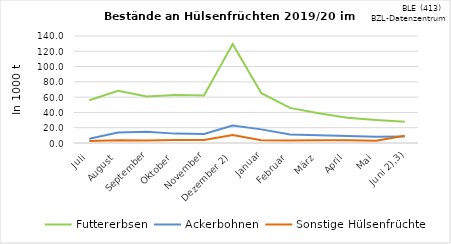
| Category | Futtererbsen | Ackerbohnen | Sonstige Hülsenfrüchte |
|---|---|---|---|
| Juli | 55.883 | 5.609 | 2.654 |
| August | 68.289 | 13.662 | 3.691 |
| September | 60.772 | 14.666 | 3.425 |
| Oktober | 62.687 | 12.267 | 3.814 |
| November | 62.228 | 11.939 | 4.077 |
|  Dezember 2) | 129.423 | 22.742 | 10.502 |
| Januar | 65.097 | 17.837 | 3.556 |
| Februar | 45.944 | 11.21 | 3.274 |
| März | 39.019 | 10.091 | 3.664 |
| April | 32.898 | 9.312 | 3.496 |
| Mai | 30.009 | 8.166 | 3.085 |
|    Juni 2),3) | 27.802 | 8.393 | 9.448 |